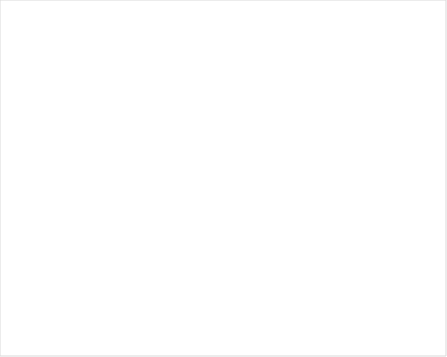
| Category | Total |
|---|---|
| 😁 | 50 |
| 🙂 | 35 |
| 😐 | 23 |
| ☹️
 | 9 |